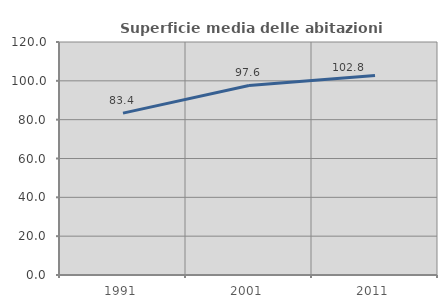
| Category | Superficie media delle abitazioni occupate |
|---|---|
| 1991.0 | 83.368 |
| 2001.0 | 97.638 |
| 2011.0 | 102.797 |